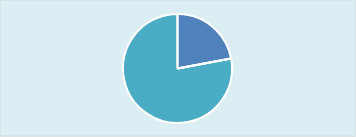
| Category | ebooks |
|---|---|
| non-circulated | 15014 |
|  | 0 |
| circulated | 53014 |